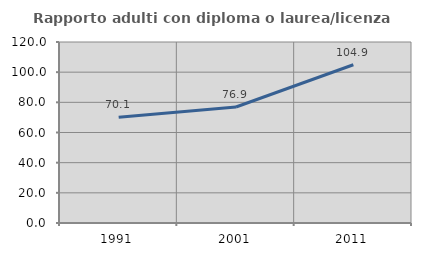
| Category | Rapporto adulti con diploma o laurea/licenza media  |
|---|---|
| 1991.0 | 70.115 |
| 2001.0 | 76.923 |
| 2011.0 | 104.918 |